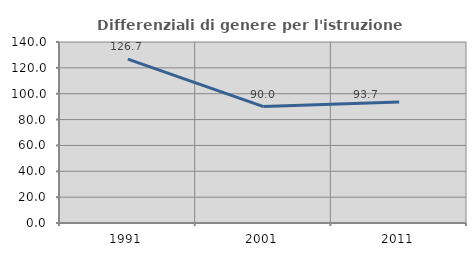
| Category | Differenziali di genere per l'istruzione superiore |
|---|---|
| 1991.0 | 126.743 |
| 2001.0 | 90.019 |
| 2011.0 | 93.68 |